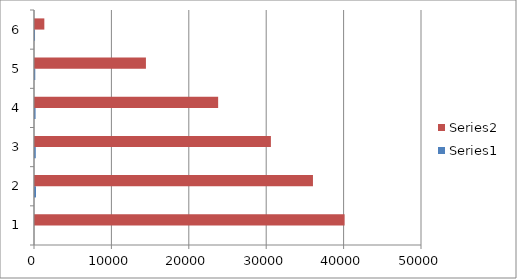
| Category | Series 0 | Series 1 |
|---|---|---|
| 0 | 0 | 40000 |
| 1 | 133 | 35912 |
| 2 | 101 | 30478 |
| 3 | 75 | 23663 |
| 4 | 36 | 14332 |
| 5 | 3 | 1206 |